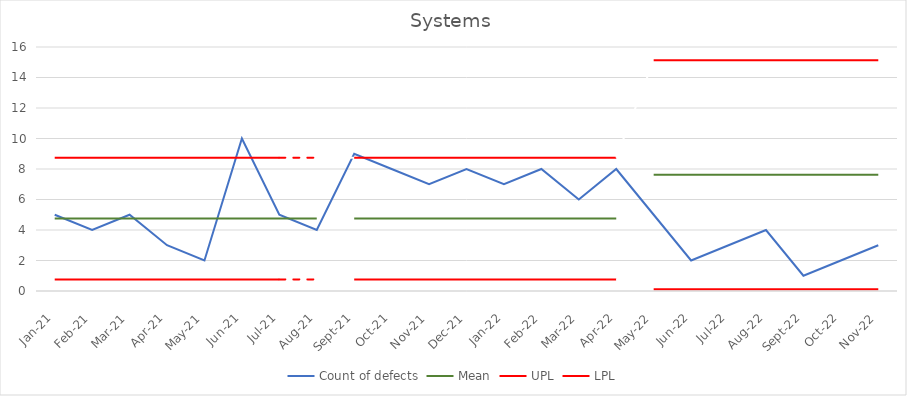
| Category | Count of defects | Mean | UPL | LPL |
|---|---|---|---|---|
| 2021-01-01 | 5 | 4.75 | 8.74 | 0.76 |
| 2021-02-01 | 4 | 4.75 | 8.74 | 0.76 |
| 2021-03-01 | 5 | 4.75 | 8.74 | 0.76 |
| 2021-04-01 | 3 | 4.75 | 8.74 | 0.76 |
| 2021-05-01 | 2 | 4.75 | 8.74 | 0.76 |
| 2021-06-01 | 10 | 4.75 | 8.74 | 0.76 |
| 2021-07-01 | 5 | 4.75 | 8.74 | 0.76 |
| 2021-08-01 | 4 | 4.75 | 8.74 | 0.76 |
| 2021-09-01 | 9 | 4.75 | 8.74 | 0.76 |
| 2021-10-01 | 8 | 4.75 | 8.74 | 0.76 |
| 2021-11-01 | 7 | 4.75 | 8.74 | 0.76 |
| 2021-12-01 | 8 | 4.75 | 8.74 | 0.76 |
| 2022-01-01 | 7 | 4.75 | 8.74 | 0.76 |
| 2022-02-01 | 8 | 4.75 | 8.74 | 0.76 |
| 2022-03-01 | 6 | 4.75 | 8.74 | 0.76 |
| 2022-04-01 | 8 | 4.75 | 8.74 | 0.76 |
| 2022-05-01 | 5 | 7.625 | 15.13 | 0.12 |
| 2022-06-01 | 2 | 7.625 | 15.13 | 0.12 |
| 2022-07-01 | 3 | 7.625 | 15.13 | 0.12 |
| 2022-08-01 | 4 | 7.625 | 15.13 | 0.12 |
| 2022-09-01 | 1 | 7.625 | 15.13 | 0.12 |
| 2022-10-01 | 2 | 7.625 | 15.13 | 0.12 |
| 2022-11-01 | 3 | 7.625 | 15.13 | 0.12 |